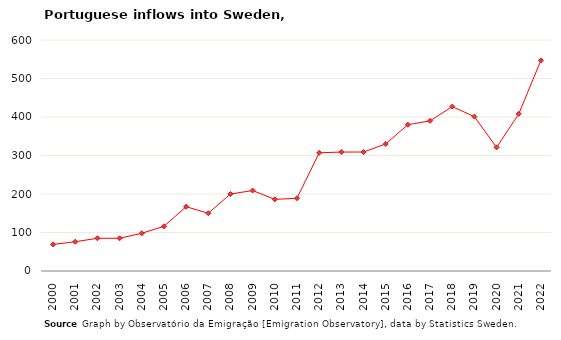
| Category | Entradas |
|---|---|
| 2000.0 | 69 |
| 2001.0 | 76 |
| 2002.0 | 85 |
| 2003.0 | 85 |
| 2004.0 | 98 |
| 2005.0 | 116 |
| 2006.0 | 167 |
| 2007.0 | 150 |
| 2008.0 | 200 |
| 2009.0 | 209 |
| 2010.0 | 186 |
| 2011.0 | 189 |
| 2012.0 | 307 |
| 2013.0 | 309 |
| 2014.0 | 309 |
| 2015.0 | 330 |
| 2016.0 | 380 |
| 2017.0 | 390 |
| 2018.0 | 427 |
| 2019.0 | 401 |
| 2020.0 | 321 |
| 2021.0 | 408 |
| 2022.0 | 547 |